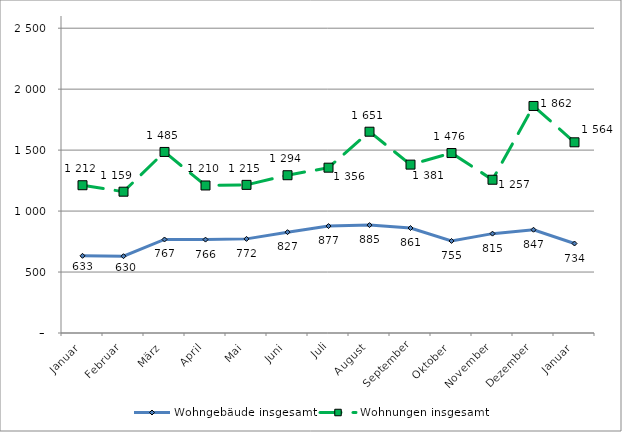
| Category | Wohngebäude insgesamt | Wohnungen insgesamt |
|---|---|---|
| Januar | 633 | 1212 |
| Februar | 630 | 1159 |
| März | 767 | 1485 |
| April | 766 | 1210 |
| Mai | 772 | 1215 |
| Juni | 827 | 1294 |
| Juli | 877 | 1356 |
| August | 885 | 1651 |
| September | 861 | 1381 |
| Oktober | 755 | 1476 |
| November | 815 | 1257 |
| Dezember | 847 | 1862 |
| Januar | 734 | 1564 |